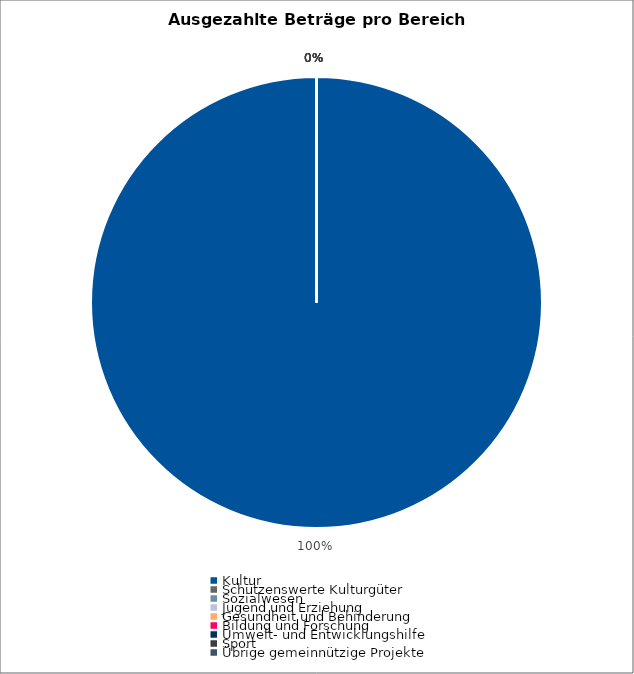
| Category | Series 0 |
|---|---|
| Kultur | 20825562.05 |
| Schützenswerte Kulturgüter | 0 |
| Sozialwesen | 0 |
| Jugend und Erziehung | 0 |
| Gesundheit und Behinderung | 0 |
| Bildung und Forschung | 0 |
| Umwelt- und Entwicklungshilfe | 0 |
| Sport | 0 |
| Übrige gemeinnützige Projekte | 0 |